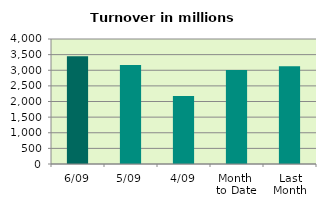
| Category | Series 0 |
|---|---|
| 6/09 | 3449.329 |
| 5/09 | 3167.68 |
| 4/09 | 2175.012 |
| Month 
to Date | 3004.934 |
| Last
Month | 3127.739 |